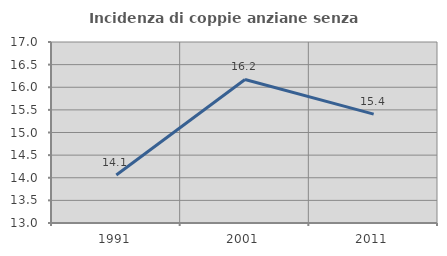
| Category | Incidenza di coppie anziane senza figli  |
|---|---|
| 1991.0 | 14.062 |
| 2001.0 | 16.172 |
| 2011.0 | 15.406 |